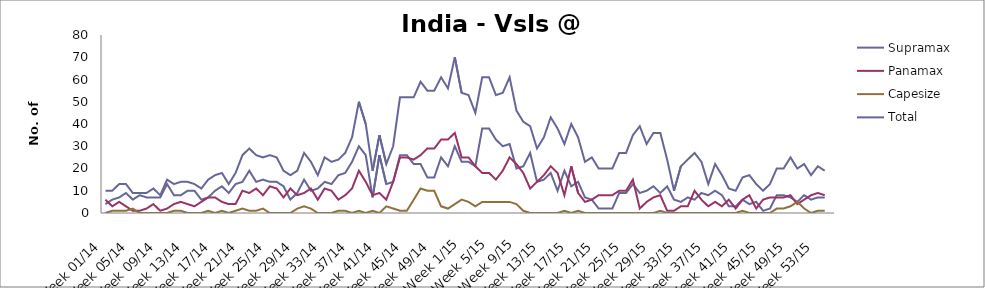
| Category | Supramax | Panamax | Capesize | Total |
|---|---|---|---|---|
| Week 01/14 | 4 | 6 | 0 | 10 |
| Week 02/14 | 6 | 3 | 1 | 10 |
| Week 03/14 | 7 | 5 | 1 | 13 |
| Week 04/14 | 9 | 3 | 1 | 13 |
| Week 05/14 | 6 | 1 | 2 | 9 |
| Week 06/14 | 8 | 1 | 0 | 9 |
| Week 07/14 | 7 | 2 | 0 | 9 |
| Week 08/14 | 7 | 4 | 0 | 11 |
| Week 09/14 | 7 | 1 | 0 | 8 |
| Week 10/14 | 13 | 2 | 0 | 15 |
| Week 11/14 | 8 | 4 | 1 | 13 |
| Week 12/14 | 8 | 5 | 1 | 14 |
| Week 13/14 | 10 | 4 | 0 | 14 |
| Week 14/14 | 10 | 3 | 0 | 13 |
| Week 15/14 | 6 | 5 | 0 | 11 |
| Week 16/14 | 7 | 7 | 1 | 15 |
| Week 17/14 | 10 | 7 | 0 | 17 |
| Week 18/14 | 12 | 5 | 1 | 18 |
| Week 19/14 | 9 | 4 | 0 | 13 |
| Week 20/14 | 13 | 4 | 1 | 18 |
| Week 21/14 | 14 | 10 | 2 | 26 |
| Week 22/14 | 19 | 9 | 1 | 29 |
| Week 23/14 | 14 | 11 | 1 | 26 |
| Week 24/14 | 15 | 8 | 2 | 25 |
| Week 25/14 | 14 | 12 | 0 | 26 |
| Week 26/14 | 14 | 11 | 0 | 25 |
| Week 27/14 | 12 | 7 | 0 | 19 |
| Week 28/14 | 6 | 11 | 0 | 17 |
| Week 29/14 | 9 | 8 | 2 | 19 |
| Week 30/14 | 15 | 9 | 3 | 27 |
| Week 31/14 | 10 | 11 | 2 | 23 |
| Week 32/14 | 11 | 6 | 0 | 17 |
| Week 33/14 | 14 | 11 | 0 | 25 |
| Week 34/14 | 13 | 10 | 0 | 23 |
| Week 35/14 | 17 | 6 | 1 | 24 |
| Week 36/14 | 18 | 8 | 1 | 27 |
| Week 37/14 | 23 | 11 | 0 | 34 |
| Week 38/14 | 30 | 19 | 1 | 50 |
| Week 39/14 | 26 | 14 | 0 | 40 |
| Week 40/14 | 7 | 8 | 1 | 19 |
| Week 41/14 | 26 | 9 | 0 | 35 |
| Week 42/14 | 13 | 6 | 3 | 22 |
| Week 43/14 | 14 | 14 | 2 | 30 |
| Week 44/14 | 26 | 25 | 1 | 52 |
| Week 45/14 | 26 | 25 | 1 | 52 |
| Week 46/14 | 22 | 24 | 6 | 52 |
| Week 47/14 | 22 | 26 | 11 | 59 |
| Week 48/14 | 16 | 29 | 10 | 55 |
| Week 49/14 | 16 | 29 | 10 | 55 |
| Week 50/14 | 25 | 33 | 3 | 61 |
| Week 51/14 | 21 | 33 | 2 | 56 |
| Week 52/14 | 30 | 36 | 4 | 70 |
| Week 1/15 | 23 | 25 | 6 | 54 |
| Week 2/15 | 23 | 25 | 5 | 53 |
| Week 3/15 | 21 | 21 | 3 | 45 |
| Week 4/15 | 38 | 18 | 5 | 61 |
| Week 5/15 | 38 | 18 | 5 | 61 |
| Week 6/15 | 33 | 15 | 5 | 53 |
| Week 7/15 | 30 | 19 | 5 | 54 |
| Week 8/15 | 31 | 25 | 5 | 61 |
| Week 9/15 | 20 | 22 | 4 | 46 |
| Week 10/15 | 21 | 18 | 1 | 41 |
| Week 11/15 | 27 | 11 | 0 | 39 |
| Week 12/15 | 14 | 14 | 0 | 29 |
| Week 13/15 | 15 | 17 | 0 | 34 |
| Week 14/15 | 18 | 21 | 0 | 43 |
| Week 15/15 | 10 | 18 | 0 | 38 |
| Week 16/15 | 19 | 8 | 1 | 31 |
| Week 17/15 | 12 | 21 | 0 | 40 |
| Week 18/15 | 14 | 9 | 1 | 34 |
| Week 19/15 | 7 | 5 | 0 | 23 |
| Week 20/15 | 6 | 6 | 0 | 25 |
| Week 21/15 | 2 | 8 | 0 | 20 |
| Week 22/15 | 2 | 8 | 0 | 20 |
| Week 23/15 | 2 | 8 | 0 | 20 |
| Week 24/15 | 9 | 10 | 0 | 27 |
| Week 25/15 | 9 | 10 | 0 | 27 |
| Week 26/15 | 13 | 15 | 0 | 35 |
| Week 27/15 | 9 | 2 | 0 | 39 |
| Week 28/15 | 10 | 5 | 0 | 31 |
| Week 29/15 | 12 | 7 | 0 | 36 |
| Week 30/15 | 9 | 8 | 1 | 36 |
| Week 31/15 | 12 | 1 | 0 | 24 |
| Week 32/15 | 6 | 1 | 0 | 10 |
| Week 33/15 | 5 | 3 | 0 | 21 |
| Week 34/15 | 7 | 3 | 0 | 24 |
| Week 35/15 | 6 | 10 | 0 | 27 |
| Week 36/15 | 9 | 6 | 0 | 23 |
| Week 37/15 | 8 | 3 | 0 | 13 |
| Week 38/15 | 10 | 5 | 0 | 22 |
| Week 39/15 | 8 | 3 | 0 | 17 |
| Week 40/15 | 3 | 6 | 0 | 11 |
| Week 41/15 | 3 | 2 | 0 | 10 |
| Week 42/15 | 6 | 6 | 1 | 16 |
| Week 43/15 | 4 | 8 | 0 | 17 |
| Week 44/15 | 5 | 2 | 0 | 13 |
| Week 45/15 | 1 | 6 | 0 | 10 |
| Week 46/15 | 2 | 7 | 0 | 13 |
| Week 47/15 | 8 | 7 | 2 | 20 |
| Week 48/15 | 8 | 7 | 2 | 20 |
| Week 49/15 | 7 | 8 | 3 | 25 |
| Week 50/15 | 5 | 4 | 5 | 20 |
| Week 51/15 | 8 | 6 | 2 | 22 |
| Week 52/15 | 6 | 8 | 0 | 17 |
| Week 53/15 | 7 | 9 | 1 | 21 |
| Week 01/16 | 7 | 8 | 1 | 19 |